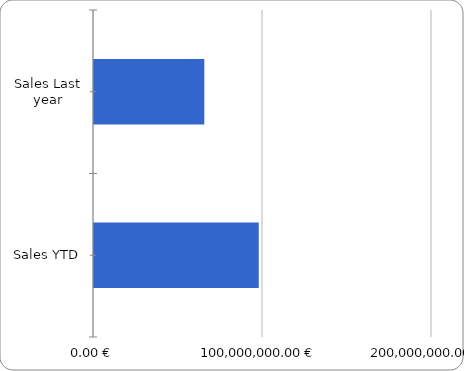
| Category | Series 0 |
|---|---|
| Sales YTD | 97487441.903 |
| Sales Last year | 65277921.384 |